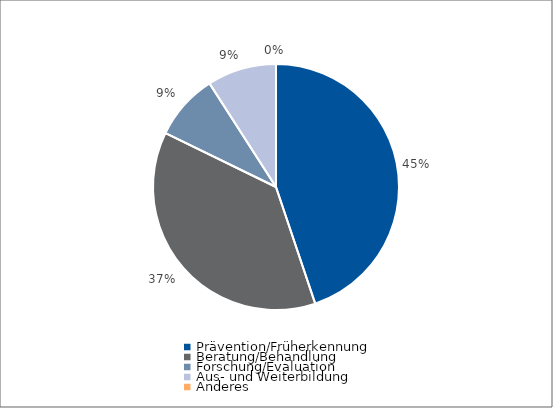
| Category | Series 0 |
|---|---|
| Prävention/Früherkennung | 57952.75 |
| Beratung/Behandlung | 48326.8 |
| Forschung/Evaluation | 11230 |
| Aus- und Weiterbildung | 11743.1 |
| Anderes | 0 |